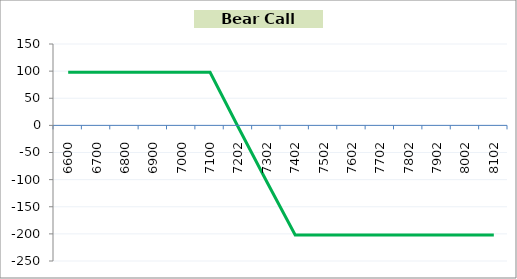
| Category | Series 1 |
|---|---|
| 6600.0 | 98 |
| 6700.0 | 98 |
| 6800.0 | 98 |
| 6900.0 | 98 |
| 7000.0 | 98 |
| 7100.0 | 98 |
| 7202.0 | -4 |
| 7302.0 | -104 |
| 7402.0 | -202 |
| 7502.0 | -202 |
| 7602.0 | -202 |
| 7702.0 | -202 |
| 7802.0 | -202 |
| 7902.0 | -202 |
| 8002.0 | -202 |
| 8102.0 | -202 |